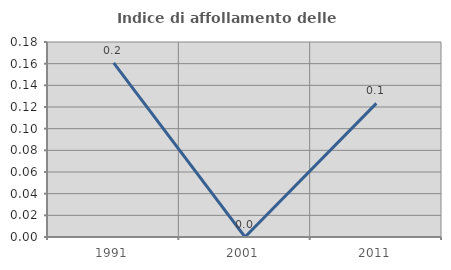
| Category | Indice di affollamento delle abitazioni  |
|---|---|
| 1991.0 | 0.161 |
| 2001.0 | 0 |
| 2011.0 | 0.123 |